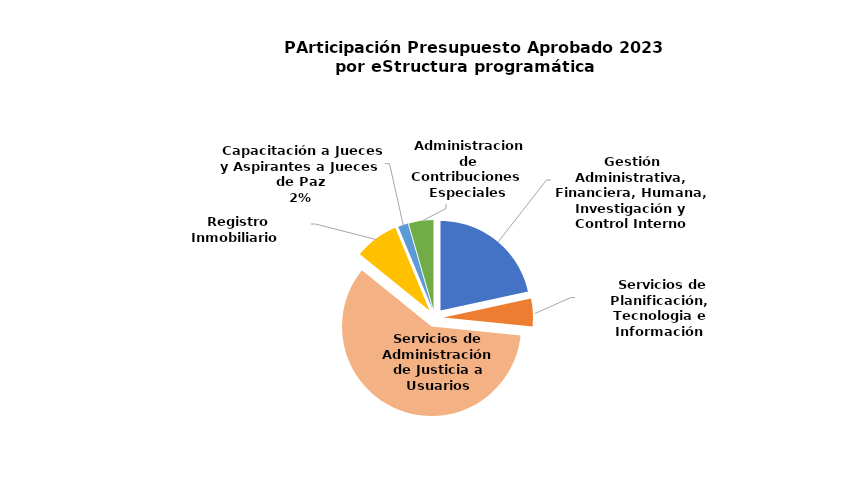
| Category | Series 0 |
|---|---|
| Gestión Administrativa, Financiera, Humana, Investigación y Control Interno | 21.617 |
|  Servicios de Planificación, Tecnologia e Información | 5.002 |
| Servicios de Administración de Justicia a Usuarios | 59.198 |
|  Registro Inmobiliario | 7.934 |
|  Capacitación a Jueces y Aspirantes a Jueces de Paz | 1.798 |
|  Administracion de Contribuciones Especiales | 4.45 |